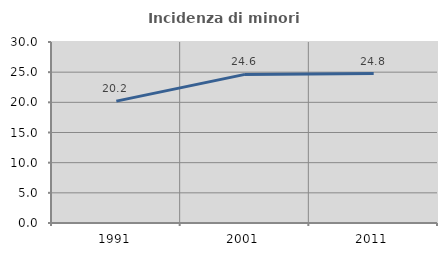
| Category | Incidenza di minori stranieri |
|---|---|
| 1991.0 | 20.202 |
| 2001.0 | 24.632 |
| 2011.0 | 24.763 |